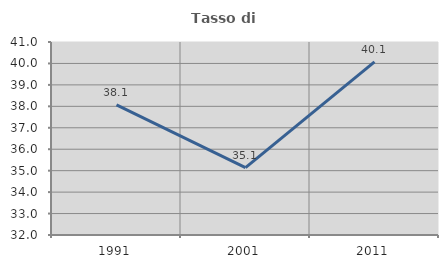
| Category | Tasso di occupazione   |
|---|---|
| 1991.0 | 38.068 |
| 2001.0 | 35.143 |
| 2011.0 | 40.071 |